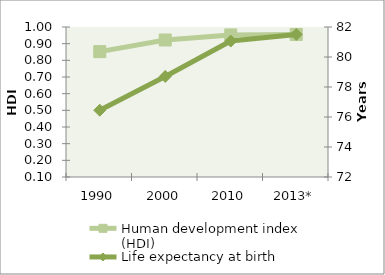
| Category | Human development index (HDI) |
|---|---|
| 1990 | 0.852 |
| 2000 | 0.922 |
| 2010 | 0.952 |
| 2013* | 0.955 |